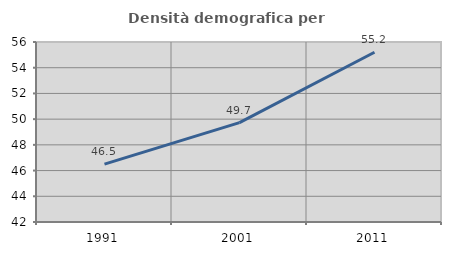
| Category | Densità demografica |
|---|---|
| 1991.0 | 46.499 |
| 2001.0 | 49.728 |
| 2011.0 | 55.204 |